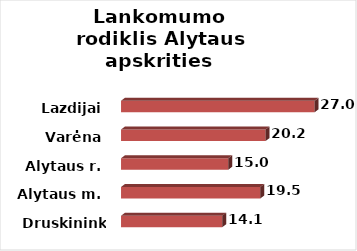
| Category | Series 0 |
|---|---|
| Druskininkai | 14.14 |
| Alytaus m. | 19.45 |
| Alytaus r. | 14.97 |
| Varėna | 20.18 |
| Lazdijai | 27.02 |